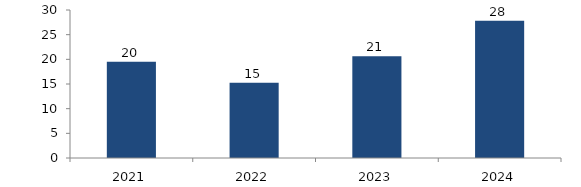
| Category | Bogotá |
|---|---|
| 2021.0 | 19.506 |
| 2022.0 | 15.255 |
| 2023.0 | 20.61 |
| 2024.0 | 27.833 |